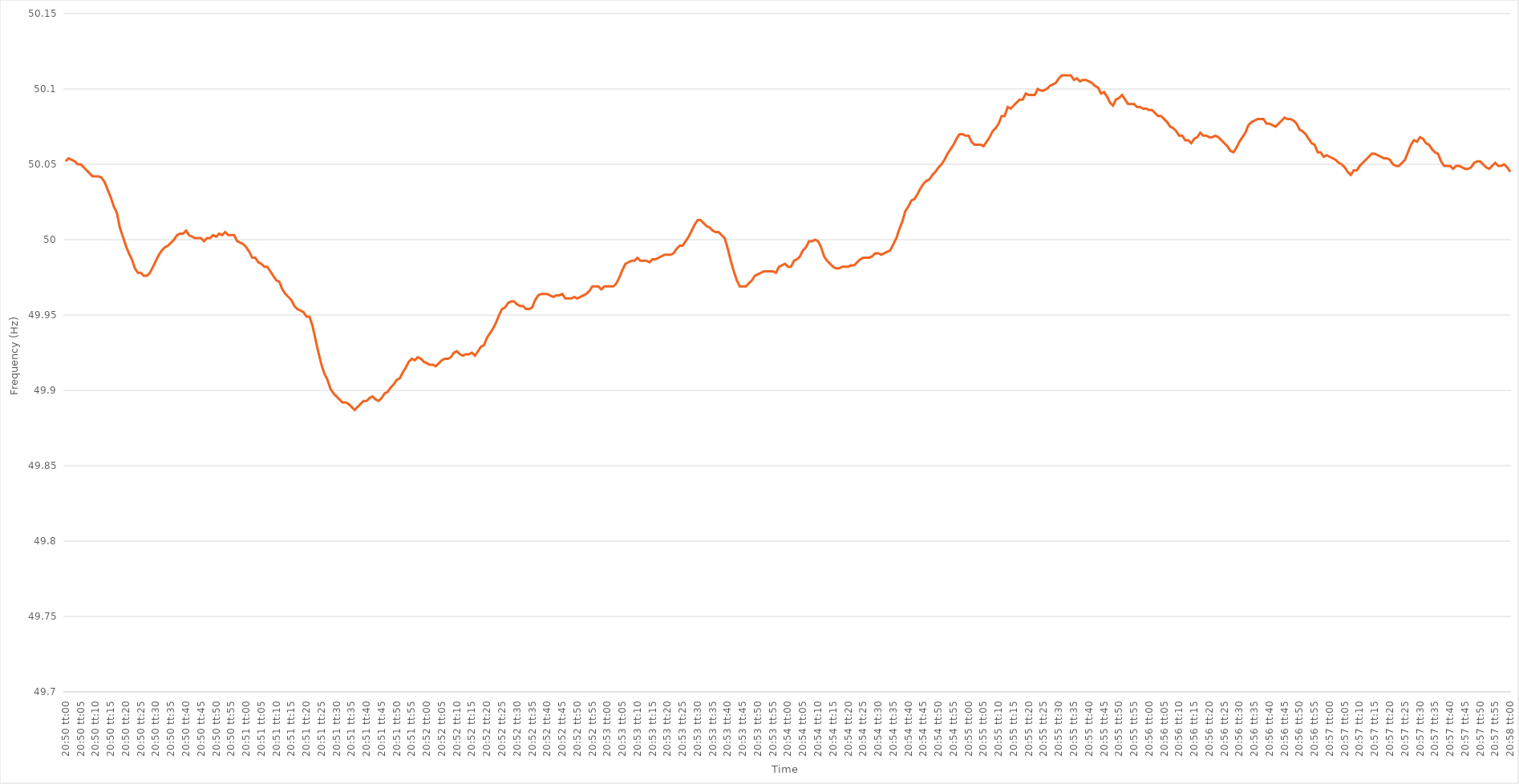
| Category | Series 0 |
|---|---|
| 0.8680555555555555 | 50.052 |
| 0.8680671296296296 | 50.054 |
| 0.8680787037037038 | 50.053 |
| 0.8680902777777778 | 50.052 |
| 0.8681018518518518 | 50.05 |
| 0.8681134259259259 | 50.05 |
| 0.868125 | 50.048 |
| 0.868136574074074 | 50.046 |
| 0.8681481481481481 | 50.044 |
| 0.8681597222222223 | 50.042 |
| 0.8681712962962963 | 50.042 |
| 0.8681828703703703 | 50.042 |
| 0.8681944444444444 | 50.041 |
| 0.8682060185185185 | 50.038 |
| 0.8682175925925927 | 50.033 |
| 0.8682291666666666 | 50.028 |
| 0.8682407407407408 | 50.022 |
| 0.8682523148148148 | 50.018 |
| 0.868263888888889 | 50.008 |
| 0.8682754629629629 | 50.002 |
| 0.868287037037037 | 49.996 |
| 0.8682986111111112 | 49.991 |
| 0.8683101851851852 | 49.987 |
| 0.8683217592592593 | 49.981 |
| 0.8683333333333333 | 49.978 |
| 0.8683449074074074 | 49.978 |
| 0.8683564814814814 | 49.976 |
| 0.8683680555555555 | 49.976 |
| 0.8683796296296297 | 49.978 |
| 0.8683912037037037 | 49.982 |
| 0.8684027777777777 | 49.986 |
| 0.8684143518518518 | 49.99 |
| 0.8684259259259259 | 49.993 |
| 0.8684375000000001 | 49.995 |
| 0.868449074074074 | 49.996 |
| 0.8684606481481482 | 49.998 |
| 0.8684722222222222 | 50 |
| 0.8684837962962964 | 50.003 |
| 0.8684953703703703 | 50.004 |
| 0.8685069444444444 | 50.004 |
| 0.8685185185185186 | 50.006 |
| 0.8685300925925926 | 50.003 |
| 0.8685416666666667 | 50.002 |
| 0.8685532407407407 | 50.001 |
| 0.8685648148148148 | 50.001 |
| 0.868576388888889 | 50.001 |
| 0.8685879629629629 | 49.999 |
| 0.8685995370370371 | 50.001 |
| 0.8686111111111111 | 50.001 |
| 0.8686226851851853 | 50.003 |
| 0.8686342592592592 | 50.002 |
| 0.8686458333333333 | 50.004 |
| 0.8686574074074075 | 50.003 |
| 0.8686689814814814 | 50.005 |
| 0.8686805555555556 | 50.003 |
| 0.8686921296296296 | 50.003 |
| 0.8687037037037038 | 50.003 |
| 0.8687152777777777 | 49.999 |
| 0.8687268518518518 | 49.998 |
| 0.868738425925926 | 49.997 |
| 0.86875 | 49.995 |
| 0.8687615740740741 | 49.992 |
| 0.8687731481481481 | 49.988 |
| 0.8687847222222222 | 49.988 |
| 0.8687962962962964 | 49.985 |
| 0.8688078703703703 | 49.984 |
| 0.8688194444444445 | 49.982 |
| 0.8688310185185185 | 49.982 |
| 0.8688425925925927 | 49.979 |
| 0.8688541666666666 | 49.976 |
| 0.8688657407407407 | 49.973 |
| 0.8688773148148149 | 49.972 |
| 0.8688888888888888 | 49.967 |
| 0.868900462962963 | 49.964 |
| 0.868912037037037 | 49.962 |
| 0.8689236111111112 | 49.96 |
| 0.8689351851851851 | 49.956 |
| 0.8689467592592592 | 49.954 |
| 0.8689583333333334 | 49.953 |
| 0.8689699074074074 | 49.952 |
| 0.8689814814814815 | 49.949 |
| 0.8689930555555555 | 49.949 |
| 0.8690046296296297 | 49.943 |
| 0.8690162037037038 | 49.934 |
| 0.8690277777777777 | 49.925 |
| 0.8690393518518519 | 49.917 |
| 0.8690509259259259 | 49.911 |
| 0.8690625000000001 | 49.907 |
| 0.869074074074074 | 49.901 |
| 0.8690856481481481 | 49.898 |
| 0.8690972222222223 | 49.896 |
| 0.8691087962962962 | 49.894 |
| 0.8691203703703704 | 49.892 |
| 0.8691319444444444 | 49.892 |
| 0.8691435185185186 | 49.891 |
| 0.8691550925925925 | 49.889 |
| 0.8691666666666666 | 49.887 |
| 0.8691782407407408 | 49.889 |
| 0.8691898148148148 | 49.891 |
| 0.8692013888888889 | 49.893 |
| 0.8692129629629629 | 49.893 |
| 0.8692245370370371 | 49.895 |
| 0.8692361111111112 | 49.896 |
| 0.8692476851851851 | 49.894 |
| 0.8692592592592593 | 49.893 |
| 0.8692708333333333 | 49.895 |
| 0.8692824074074075 | 49.898 |
| 0.8692939814814814 | 49.899 |
| 0.8693055555555556 | 49.902 |
| 0.8693171296296297 | 49.904 |
| 0.8693287037037036 | 49.907 |
| 0.8693402777777778 | 49.908 |
| 0.8693518518518518 | 49.912 |
| 0.869363425925926 | 49.915 |
| 0.8693749999999999 | 49.919 |
| 0.869386574074074 | 49.921 |
| 0.8693981481481482 | 49.92 |
| 0.8694097222222222 | 49.922 |
| 0.8694212962962963 | 49.921 |
| 0.8694328703703703 | 49.919 |
| 0.8694444444444445 | 49.918 |
| 0.8694560185185186 | 49.917 |
| 0.8694675925925925 | 49.917 |
| 0.8694791666666667 | 49.916 |
| 0.8694907407407407 | 49.918 |
| 0.8695023148148149 | 49.92 |
| 0.8695138888888888 | 49.921 |
| 0.869525462962963 | 49.921 |
| 0.8695370370370371 | 49.922 |
| 0.869548611111111 | 49.925 |
| 0.8695601851851852 | 49.926 |
| 0.8695717592592592 | 49.924 |
| 0.8695833333333334 | 49.923 |
| 0.8695949074074073 | 49.924 |
| 0.8696064814814815 | 49.924 |
| 0.8696180555555556 | 49.925 |
| 0.8696296296296296 | 49.923 |
| 0.8696412037037037 | 49.926 |
| 0.8696527777777777 | 49.929 |
| 0.8696643518518519 | 49.93 |
| 0.869675925925926 | 49.935 |
| 0.8696875 | 49.938 |
| 0.8696990740740741 | 49.941 |
| 0.8697106481481481 | 49.945 |
| 0.8697222222222223 | 49.95 |
| 0.8697337962962962 | 49.954 |
| 0.8697453703703704 | 49.955 |
| 0.8697569444444445 | 49.958 |
| 0.8697685185185186 | 49.959 |
| 0.8697800925925926 | 49.959 |
| 0.8697916666666666 | 49.957 |
| 0.8698032407407408 | 49.956 |
| 0.8698148148148147 | 49.956 |
| 0.8698263888888889 | 49.954 |
| 0.869837962962963 | 49.954 |
| 0.869849537037037 | 49.955 |
| 0.8698611111111111 | 49.96 |
| 0.8698726851851851 | 49.963 |
| 0.8698842592592593 | 49.964 |
| 0.8698958333333334 | 49.964 |
| 0.8699074074074074 | 49.964 |
| 0.8699189814814815 | 49.963 |
| 0.8699305555555555 | 49.962 |
| 0.8699421296296297 | 49.963 |
| 0.8699537037037036 | 49.963 |
| 0.8699652777777778 | 49.964 |
| 0.8699768518518519 | 49.961 |
| 0.869988425925926 | 49.961 |
| 0.87 | 49.961 |
| 0.870011574074074 | 49.962 |
| 0.8700231481481482 | 49.961 |
| 0.8700347222222223 | 49.962 |
| 0.8700462962962963 | 49.963 |
| 0.8700578703703704 | 49.964 |
| 0.8700694444444445 | 49.966 |
| 0.8700810185185185 | 49.969 |
| 0.8700925925925925 | 49.969 |
| 0.8701041666666667 | 49.969 |
| 0.8701157407407408 | 49.967 |
| 0.8701273148148148 | 49.969 |
| 0.8701388888888889 | 49.969 |
| 0.870150462962963 | 49.969 |
| 0.8701620370370371 | 49.969 |
| 0.870173611111111 | 49.971 |
| 0.8701851851851852 | 49.975 |
| 0.8701967592592593 | 49.98 |
| 0.8702083333333334 | 49.984 |
| 0.8702199074074074 | 49.985 |
| 0.8702314814814814 | 49.986 |
| 0.8702430555555556 | 49.986 |
| 0.8702546296296297 | 49.988 |
| 0.8702662037037037 | 49.986 |
| 0.8702777777777778 | 49.986 |
| 0.8702893518518519 | 49.986 |
| 0.8703009259259259 | 49.985 |
| 0.8703124999999999 | 49.987 |
| 0.8703240740740741 | 49.987 |
| 0.8703356481481482 | 49.988 |
| 0.8703472222222222 | 49.989 |
| 0.8703587962962963 | 49.99 |
| 0.8703703703703703 | 49.99 |
| 0.8703819444444445 | 49.99 |
| 0.8703935185185184 | 49.991 |
| 0.8704050925925926 | 49.994 |
| 0.8704166666666667 | 49.996 |
| 0.8704282407407408 | 49.996 |
| 0.8704398148148148 | 49.999 |
| 0.8704513888888888 | 50.002 |
| 0.870462962962963 | 50.006 |
| 0.8704745370370371 | 50.01 |
| 0.8704861111111111 | 50.013 |
| 0.8704976851851852 | 50.013 |
| 0.8705092592592593 | 50.011 |
| 0.8705208333333333 | 50.009 |
| 0.8705324074074073 | 50.008 |
| 0.8705439814814815 | 50.006 |
| 0.8705555555555556 | 50.005 |
| 0.8705671296296296 | 50.005 |
| 0.8705787037037037 | 50.003 |
| 0.8705902777777778 | 50.001 |
| 0.8706018518518519 | 49.994 |
| 0.8706134259259258 | 49.986 |
| 0.870625 | 49.979 |
| 0.8706365740740741 | 49.973 |
| 0.8706481481481482 | 49.969 |
| 0.8706597222222222 | 49.969 |
| 0.8706712962962962 | 49.969 |
| 0.8706828703703704 | 49.971 |
| 0.8706944444444445 | 49.973 |
| 0.8707060185185185 | 49.976 |
| 0.8707175925925926 | 49.977 |
| 0.8707291666666667 | 49.978 |
| 0.8707407407407407 | 49.979 |
| 0.8707523148148147 | 49.979 |
| 0.8707638888888889 | 49.979 |
| 0.870775462962963 | 49.979 |
| 0.870787037037037 | 49.978 |
| 0.8707986111111111 | 49.982 |
| 0.8708101851851852 | 49.983 |
| 0.8708217592592593 | 49.984 |
| 0.8708333333333332 | 49.982 |
| 0.8708449074074074 | 49.982 |
| 0.8708564814814815 | 49.986 |
| 0.8708680555555556 | 49.987 |
| 0.8708796296296296 | 49.989 |
| 0.8708912037037037 | 49.993 |
| 0.8709027777777778 | 49.995 |
| 0.870914351851852 | 49.999 |
| 0.8709259259259259 | 49.999 |
| 0.8709375 | 50 |
| 0.8709490740740741 | 49.999 |
| 0.8709606481481481 | 49.995 |
| 0.8709722222222221 | 49.989 |
| 0.8709837962962963 | 49.986 |
| 0.8709953703703704 | 49.984 |
| 0.8710069444444444 | 49.982 |
| 0.8710185185185185 | 49.981 |
| 0.8710300925925926 | 49.981 |
| 0.8710416666666667 | 49.982 |
| 0.8710532407407406 | 49.982 |
| 0.8710648148148148 | 49.982 |
| 0.8710763888888889 | 49.983 |
| 0.871087962962963 | 49.983 |
| 0.871099537037037 | 49.985 |
| 0.8711111111111111 | 49.987 |
| 0.8711226851851852 | 49.988 |
| 0.8711342592592594 | 49.988 |
| 0.8711458333333333 | 49.988 |
| 0.8711574074074074 | 49.989 |
| 0.8711689814814815 | 49.991 |
| 0.8711805555555556 | 49.991 |
| 0.8711921296296296 | 49.99 |
| 0.8712037037037037 | 49.991 |
| 0.8712152777777779 | 49.992 |
| 0.8712268518518519 | 49.993 |
| 0.8712384259259259 | 49.997 |
| 0.87125 | 50.001 |
| 0.8712615740740741 | 50.007 |
| 0.871273148148148 | 50.012 |
| 0.8712847222222222 | 50.019 |
| 0.8712962962962963 | 50.022 |
| 0.8713078703703704 | 50.026 |
| 0.8713194444444444 | 50.027 |
| 0.8713310185185185 | 50.03 |
| 0.8713425925925926 | 50.034 |
| 0.8713541666666668 | 50.037 |
| 0.8713657407407407 | 50.039 |
| 0.8713773148148148 | 50.04 |
| 0.8713888888888889 | 50.043 |
| 0.871400462962963 | 50.045 |
| 0.871412037037037 | 50.048 |
| 0.8714236111111111 | 50.05 |
| 0.8714351851851853 | 50.053 |
| 0.8714467592592593 | 50.057 |
| 0.8714583333333333 | 50.06 |
| 0.8714699074074074 | 50.063 |
| 0.8714814814814815 | 50.067 |
| 0.8714930555555555 | 50.07 |
| 0.8715046296296296 | 50.07 |
| 0.8715162037037038 | 50.069 |
| 0.8715277777777778 | 50.069 |
| 0.8715393518518518 | 50.065 |
| 0.8715509259259259 | 50.063 |
| 0.8715625 | 50.063 |
| 0.8715740740740742 | 50.063 |
| 0.8715856481481481 | 50.062 |
| 0.8715972222222222 | 50.065 |
| 0.8716087962962963 | 50.068 |
| 0.8716203703703704 | 50.072 |
| 0.8716319444444444 | 50.074 |
| 0.8716435185185185 | 50.077 |
| 0.8716550925925927 | 50.082 |
| 0.8716666666666667 | 50.082 |
| 0.8716782407407407 | 50.088 |
| 0.8716898148148148 | 50.087 |
| 0.8717013888888889 | 50.089 |
| 0.8717129629629629 | 50.091 |
| 0.871724537037037 | 50.093 |
| 0.8717361111111112 | 50.093 |
| 0.8717476851851852 | 50.097 |
| 0.8717592592592592 | 50.096 |
| 0.8717708333333333 | 50.096 |
| 0.8717824074074074 | 50.096 |
| 0.8717939814814816 | 50.1 |
| 0.8718055555555555 | 50.099 |
| 0.8718171296296297 | 50.099 |
| 0.8718287037037037 | 50.1 |
| 0.8718402777777778 | 50.102 |
| 0.8718518518518518 | 50.103 |
| 0.8718634259259259 | 50.104 |
| 0.8718750000000001 | 50.107 |
| 0.8718865740740741 | 50.109 |
| 0.8718981481481481 | 50.109 |
| 0.8719097222222222 | 50.109 |
| 0.8719212962962963 | 50.109 |
| 0.8719328703703703 | 50.106 |
| 0.8719444444444444 | 50.107 |
| 0.8719560185185186 | 50.105 |
| 0.8719675925925926 | 50.106 |
| 0.8719791666666666 | 50.106 |
| 0.8719907407407407 | 50.105 |
| 0.8720023148148148 | 50.104 |
| 0.872013888888889 | 50.102 |
| 0.8720254629629629 | 50.101 |
| 0.872037037037037 | 50.097 |
| 0.8720486111111111 | 50.098 |
| 0.8720601851851852 | 50.095 |
| 0.8720717592592592 | 50.091 |
| 0.8720833333333333 | 50.089 |
| 0.8720949074074075 | 50.093 |
| 0.8721064814814815 | 50.094 |
| 0.8721180555555555 | 50.096 |
| 0.8721296296296296 | 50.093 |
| 0.8721412037037037 | 50.09 |
| 0.8721527777777777 | 50.09 |
| 0.8721643518518518 | 50.09 |
| 0.872175925925926 | 50.088 |
| 0.8721875 | 50.088 |
| 0.872199074074074 | 50.087 |
| 0.8722106481481481 | 50.087 |
| 0.8722222222222222 | 50.086 |
| 0.8722337962962964 | 50.086 |
| 0.8722453703703703 | 50.084 |
| 0.8722569444444445 | 50.082 |
| 0.8722685185185185 | 50.082 |
| 0.8722800925925926 | 50.08 |
| 0.8722916666666666 | 50.078 |
| 0.8723032407407407 | 50.075 |
| 0.8723148148148149 | 50.074 |
| 0.8723263888888889 | 50.072 |
| 0.872337962962963 | 50.069 |
| 0.872349537037037 | 50.069 |
| 0.8723611111111111 | 50.066 |
| 0.8723726851851853 | 50.066 |
| 0.8723842592592592 | 50.064 |
| 0.8723958333333334 | 50.067 |
| 0.8724074074074074 | 50.068 |
| 0.8724189814814814 | 50.071 |
| 0.8724305555555555 | 50.069 |
| 0.8724421296296296 | 50.069 |
| 0.8724537037037038 | 50.068 |
| 0.8724652777777777 | 50.068 |
| 0.8724768518518519 | 50.069 |
| 0.8724884259259259 | 50.068 |
| 0.8725 | 50.066 |
| 0.872511574074074 | 50.064 |
| 0.8725231481481481 | 50.062 |
| 0.8725347222222223 | 50.059 |
| 0.8725462962962963 | 50.058 |
| 0.8725578703703704 | 50.061 |
| 0.8725694444444444 | 50.065 |
| 0.8725810185185185 | 50.068 |
| 0.8725925925925927 | 50.071 |
| 0.8726041666666666 | 50.076 |
| 0.8726157407407408 | 50.078 |
| 0.8726273148148148 | 50.079 |
| 0.872638888888889 | 50.08 |
| 0.8726504629629629 | 50.08 |
| 0.872662037037037 | 50.08 |
| 0.8726736111111112 | 50.077 |
| 0.8726851851851851 | 50.077 |
| 0.8726967592592593 | 50.076 |
| 0.8727083333333333 | 50.075 |
| 0.8727199074074075 | 50.077 |
| 0.8727314814814814 | 50.079 |
| 0.8727430555555555 | 50.081 |
| 0.8727546296296297 | 50.08 |
| 0.8727662037037037 | 50.08 |
| 0.8727777777777778 | 50.079 |
| 0.8727893518518518 | 50.077 |
| 0.872800925925926 | 50.073 |
| 0.8728125000000001 | 50.072 |
| 0.872824074074074 | 50.07 |
| 0.8728356481481482 | 50.067 |
| 0.8728472222222222 | 50.064 |
| 0.8728587962962964 | 50.063 |
| 0.8728703703703703 | 50.058 |
| 0.8728819444444444 | 50.058 |
| 0.8728935185185186 | 50.055 |
| 0.8729050925925925 | 50.056 |
| 0.8729166666666667 | 50.055 |
| 0.8729282407407407 | 50.054 |
| 0.8729398148148149 | 50.053 |
| 0.8729513888888888 | 50.051 |
| 0.8729629629629629 | 50.05 |
| 0.8729745370370371 | 50.048 |
| 0.8729861111111111 | 50.045 |
| 0.8729976851851852 | 50.043 |
| 0.8730092592592592 | 50.046 |
| 0.8730208333333334 | 50.046 |
| 0.8730324074074075 | 50.049 |
| 0.8730439814814814 | 50.051 |
| 0.8730555555555556 | 50.053 |
| 0.8730671296296296 | 50.055 |
| 0.8730787037037038 | 50.057 |
| 0.8730902777777777 | 50.057 |
| 0.8731018518518519 | 50.056 |
| 0.873113425925926 | 50.055 |
| 0.8731249999999999 | 50.054 |
| 0.8731365740740741 | 50.054 |
| 0.8731481481481481 | 50.053 |
| 0.8731597222222223 | 50.05 |
| 0.8731712962962962 | 50.049 |
| 0.8731828703703703 | 50.049 |
| 0.8731944444444445 | 50.051 |
| 0.8732060185185185 | 50.053 |
| 0.8732175925925926 | 50.058 |
| 0.8732291666666666 | 50.063 |
| 0.8732407407407408 | 50.066 |
| 0.8732523148148149 | 50.065 |
| 0.8732638888888888 | 50.068 |
| 0.873275462962963 | 50.067 |
| 0.873287037037037 | 50.064 |
| 0.8732986111111112 | 50.063 |
| 0.8733101851851851 | 50.06 |
| 0.8733217592592593 | 50.058 |
| 0.8733333333333334 | 50.057 |
| 0.8733449074074073 | 50.052 |
| 0.8733564814814815 | 50.049 |
| 0.8733680555555555 | 50.049 |
| 0.8733796296296297 | 50.049 |
| 0.8733912037037036 | 50.047 |
| 0.8734027777777778 | 50.049 |
| 0.8734143518518519 | 50.049 |
| 0.8734259259259259 | 50.048 |
| 0.8734375 | 50.047 |
| 0.873449074074074 | 50.047 |
| 0.8734606481481482 | 50.048 |
| 0.8734722222222223 | 50.051 |
| 0.8734837962962962 | 50.052 |
| 0.8734953703703704 | 50.052 |
| 0.8735069444444444 | 50.05 |
| 0.8735185185185186 | 50.048 |
| 0.8735300925925925 | 50.047 |
| 0.8735416666666667 | 50.049 |
| 0.8735532407407408 | 50.051 |
| 0.8735648148148147 | 50.049 |
| 0.8735763888888889 | 50.049 |
| 0.8735879629629629 | 50.05 |
| 0.8735995370370371 | 50.048 |
| 0.873611111111111 | 50.045 |